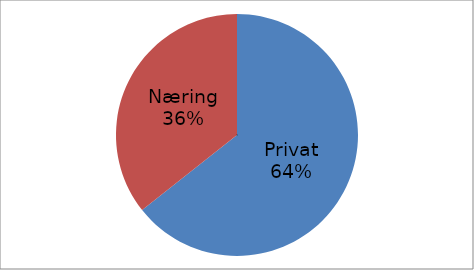
| Category | Series 0 |
|---|---|
| Privat | 40376167 |
| Næring | 22374794 |